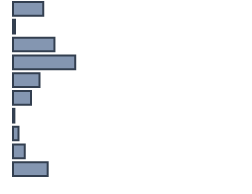
| Category | Series 0 |
|---|---|
| 0 | 12.921 |
| 1 | 0.89 |
| 2 | 17.711 |
| 3 | 26.591 |
| 4 | 11.343 |
| 5 | 7.746 |
| 6 | 0.589 |
| 7 | 2.383 |
| 8 | 5.009 |
| 9 | 14.817 |